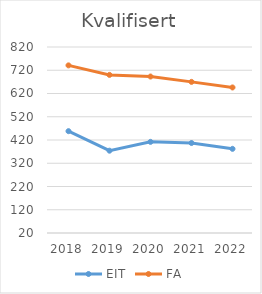
| Category | EIT | FA |
|---|---|---|
| 2018 | 458 | 741 |
| 2019 | 374 | 700 |
| 2020 | 412 | 693 |
| 2021 | 407 | 670 |
| 2022 | 382 | 646 |